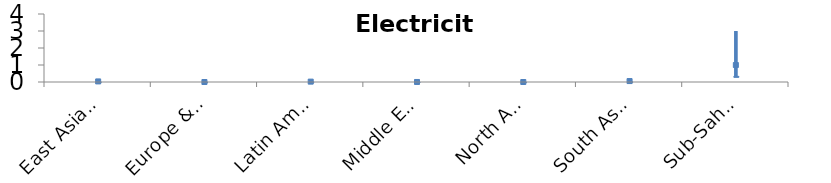
| Category | Worst | Best | Central |
|---|---|---|---|
| East Asia & Pacific | 0.102 | 0.011 | 0.034 |
| Europe & Central Asia | 0 | 0 | 0 |
| Latin America & Caribbean | 0.066 | 0.007 | 0.022 |
| Middle East & North Africa | 0.005 | 0.001 | 0.002 |
| North America | 0 | 0 | 0 |
| South Asia | 0.165 | 0.018 | 0.055 |
| Sub-Saharan Africa | 2.996 | 0.333 | 0.999 |